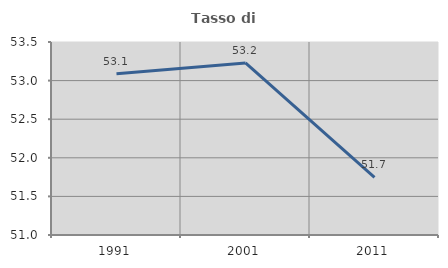
| Category | Tasso di occupazione   |
|---|---|
| 1991.0 | 53.089 |
| 2001.0 | 53.228 |
| 2011.0 | 51.748 |